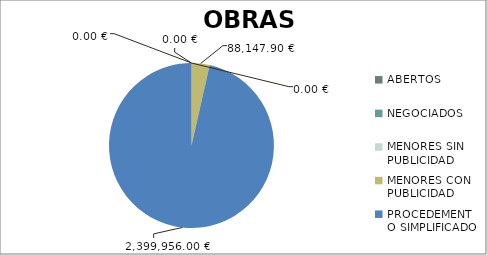
| Category | Series 0 |
|---|---|
| ABERTOS  | 0 |
| NEGOCIADOS  | 0 |
| MENORES SIN PUBLICIDAD | 0 |
| MENORES CON PUBLICIDAD | 88147.9 |
| PROCEDEMENTO SIMPLIFICADO | 2399956 |